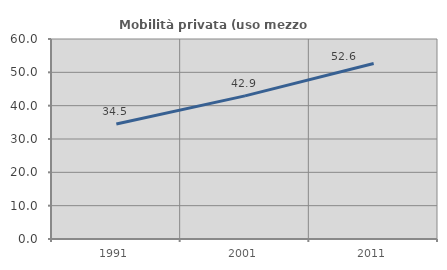
| Category | Mobilità privata (uso mezzo privato) |
|---|---|
| 1991.0 | 34.495 |
| 2001.0 | 42.932 |
| 2011.0 | 52.632 |